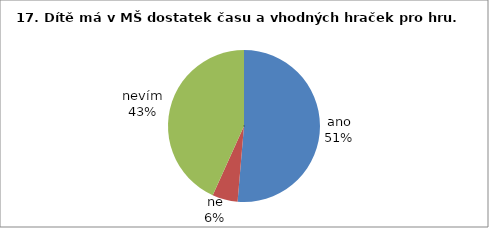
| Category | 17. Dítě má v MŠ dostatek času a vhodných hraček pro hru. |
|---|---|
| ano | 19 |
| ne | 2 |
| nevím | 16 |